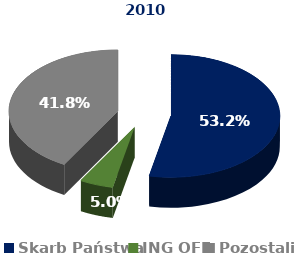
| Category | 2010 | Series 1 |
|---|---|---|
| Skarb Państwa | 0.532 |  |
| ING OFE | 0.05 |  |
| Pozostali | 0.418 |  |